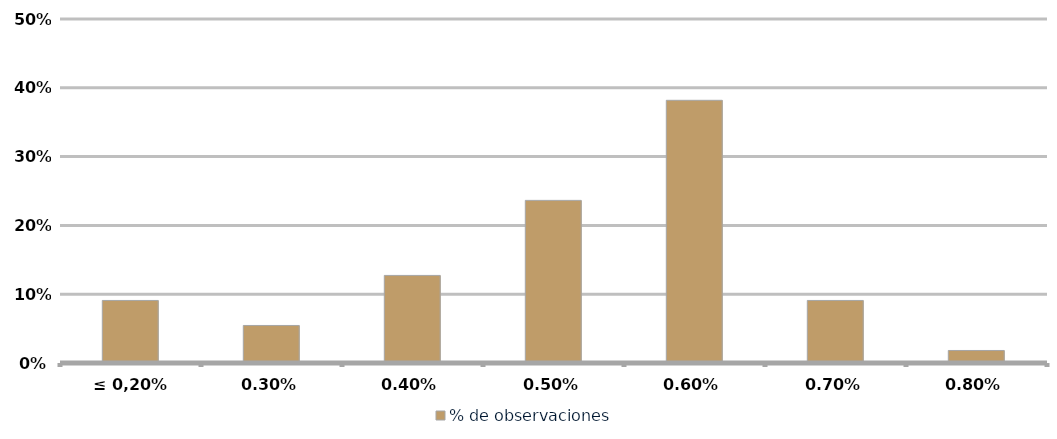
| Category | % de observaciones  |
|---|---|
| ≤ 0,20% | 0.091 |
| 0,30% | 0.055 |
| 0,40% | 0.127 |
| 0,50% | 0.236 |
| 0,60% | 0.382 |
| 0,70% | 0.091 |
| 0,80% | 0.018 |